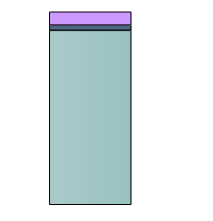
| Category | Series 0 | Series 1 | Series 2 |
|---|---|---|---|
| 0 | 628816.048 | 18756.938 | 48288.216 |